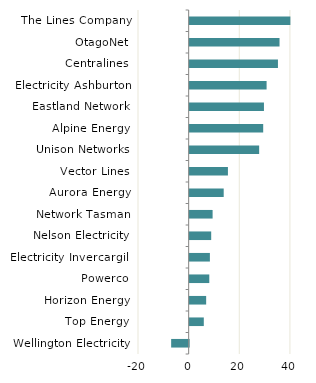
| Category | Series 0 |
|---|---|
| The Lines Company | 39.78 |
| OtagoNet | 35.496 |
| Centralines | 34.873 |
| Electricity Ashburton | 30.388 |
| Eastland Network | 29.348 |
| Alpine Energy | 29.046 |
| Unison Networks | 27.453 |
| Vector Lines | 15.116 |
| Aurora Energy | 13.448 |
| Network Tasman | 9.068 |
| Nelson Electricity | 8.511 |
| Electricity Invercargill | 7.995 |
| Powerco | 7.76 |
| Horizon Energy | 6.523 |
| Top Energy | 5.59 |
| Wellington Electricity | -6.908 |